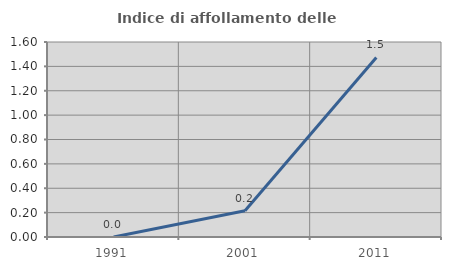
| Category | Indice di affollamento delle abitazioni  |
|---|---|
| 1991.0 | 0 |
| 2001.0 | 0.216 |
| 2011.0 | 1.473 |